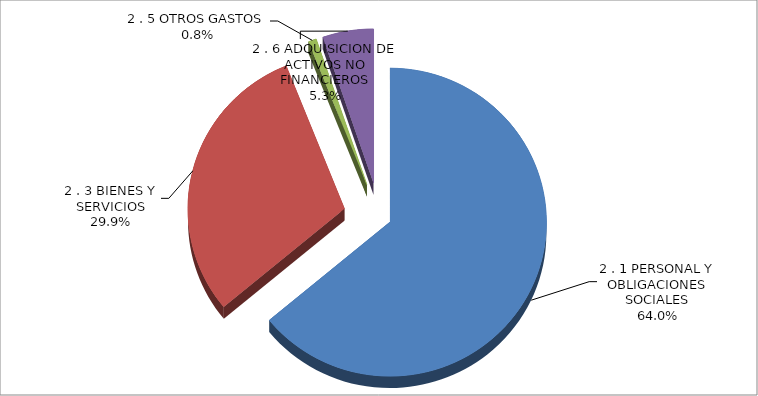
| Category | Series 0 |
|---|---|
| 2 . 1 PERSONAL Y OBLIGACIONES SOCIALES | 50471742 |
| 2 . 3 BIENES Y SERVICIOS | 23589555 |
| 2 . 5 OTROS GASTOS | 646943 |
| 2 . 6 ADQUISICION DE ACTIVOS NO FINANCIEROS | 4146860 |